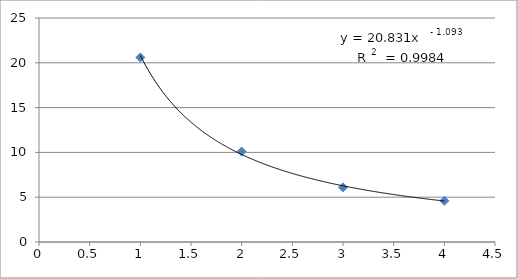
| Category | Series 0 |
|---|---|
| 1.0 | 20.6 |
| 2.0 | 10.1 |
| 3.0 | 6.1 |
| 4.0 | 4.6 |